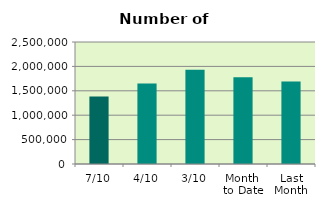
| Category | Series 0 |
|---|---|
| 7/10 | 1384948 |
| 4/10 | 1647842 |
| 3/10 | 1932092 |
| Month 
to Date | 1779041.2 |
| Last
Month | 1689477.048 |